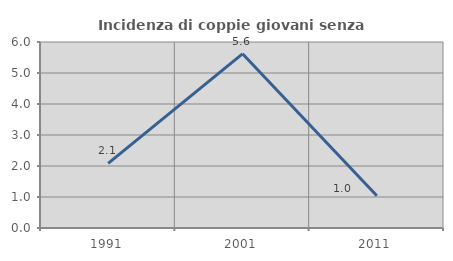
| Category | Incidenza di coppie giovani senza figli |
|---|---|
| 1991.0 | 2.083 |
| 2001.0 | 5.618 |
| 2011.0 | 1.042 |